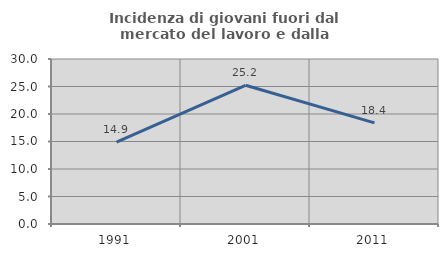
| Category | Incidenza di giovani fuori dal mercato del lavoro e dalla formazione  |
|---|---|
| 1991.0 | 14.868 |
| 2001.0 | 25.224 |
| 2011.0 | 18.376 |